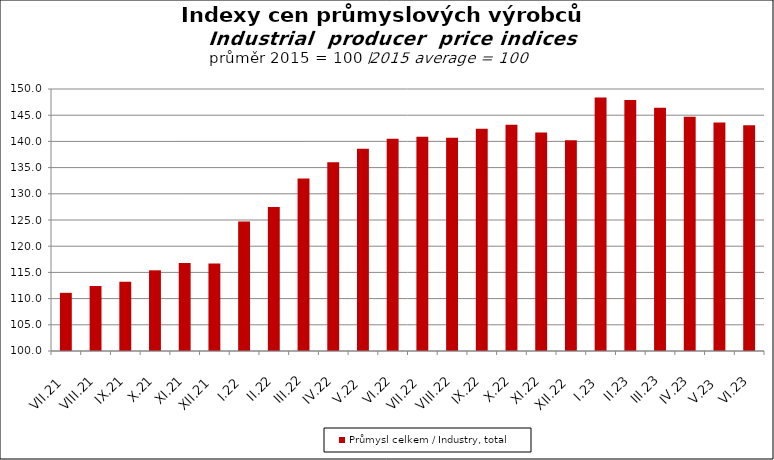
| Category | Průmysl celkem / Industry, total |
|---|---|
| VII.21 | 111.1 |
| VIII.21 | 112.4 |
| IX.21 | 113.2 |
| X.21 | 115.4 |
| XI.21 | 116.8 |
| XII.21 | 116.7 |
| I.22 | 124.7 |
| II.22 | 127.5 |
| III.22 | 132.9 |
| IV.22 | 136 |
| V.22 | 138.6 |
| VI.22 | 140.5 |
| VII.22 | 140.9 |
| VIII.22 | 140.7 |
| IX.22 | 142.4 |
| X.22 | 143.2 |
| XI.22 | 141.7 |
| XII.22 | 140.2 |
| I.23 | 148.4 |
| II.23 | 147.9 |
| III.23 | 146.4 |
| IV.23 | 144.7 |
| V.23 | 143.6 |
| VI.23 | 143.1 |